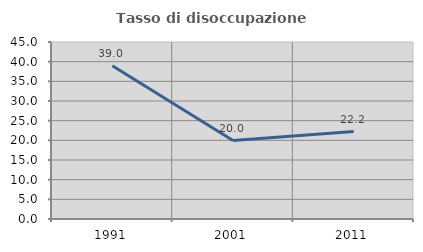
| Category | Tasso di disoccupazione giovanile  |
|---|---|
| 1991.0 | 38.951 |
| 2001.0 | 19.957 |
| 2011.0 | 22.222 |